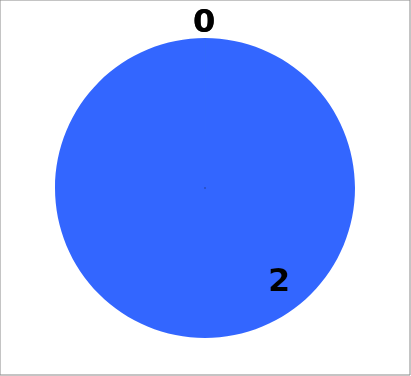
| Category | Series 0 |
|---|---|
| R | 0 |
| Y | 0 |
| B | 2 |
| G | 0 |